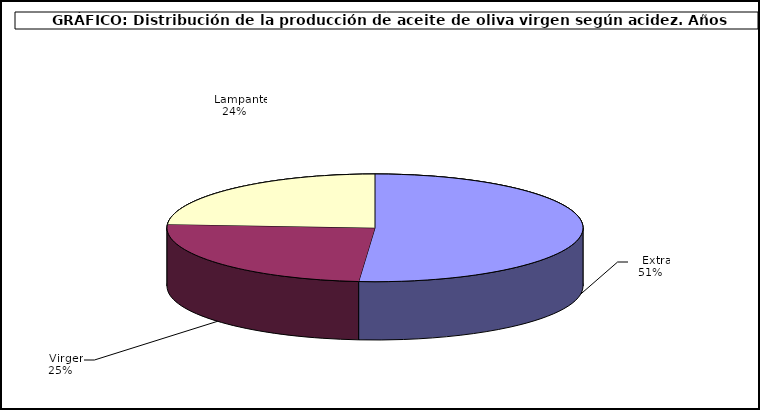
| Category | Series 0 |
|---|---|
|    Extra | 428469 |
|    Virgen | 207712 |
|    Lampante | 199888 |